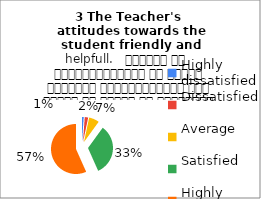
| Category | 3 The Teacher's 
attitudes towards the student friendly and helpfull.   शिक्षक का विद्यार्थियों के प्रति व्यवहार मित्रतापूर्ण एवम सहयोग के भावना से परिपूर्ण था |
|---|---|
| Highly dissatisfied | 1 |
| Dissatisfied | 2 |
| Average | 6 |
| Satisfied | 30 |
| Highly satisfied | 51 |